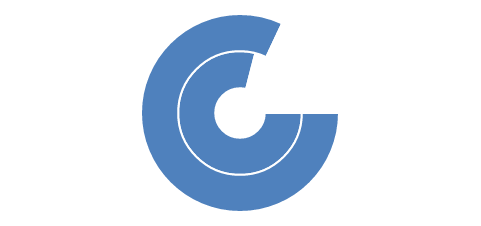
| Category | Series 1 | Series 0 |
|---|---|---|
| 0 | 0.79 | 0.82 |
| 1 | 0.21 | 0.18 |